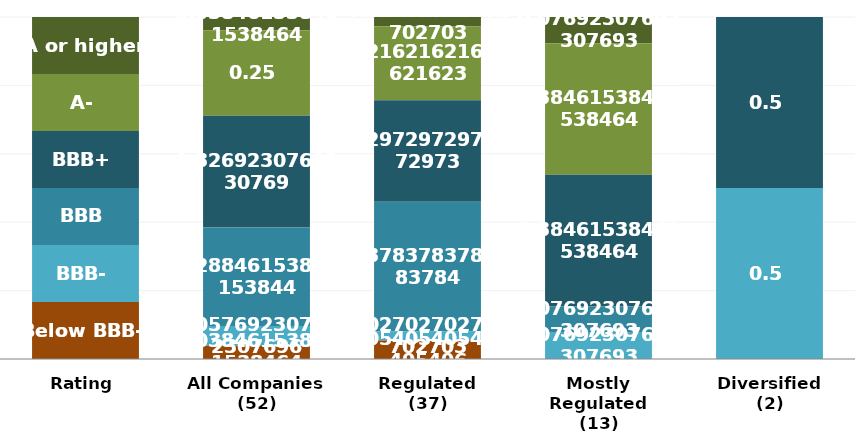
| Category | A or higher | A- | BBB+ | BBB | BBB- | Below BBB- |
|---|---|---|---|---|---|---|
| Rating | 1 | 1 | 1 | 1 | 1 | 1 |
| All Companies
(52) | 2 | 13 | 17 | 15 | 3 | 2 |
| Regulated
(37) | 1 | 8 | 11 | 14 | 1 | 2 |
| Mostly Regulated
(13) | 1 | 5 | 5 | 1 | 1 | 0 |
| Diversified
(2) | 0 | 0 | 1 | 0 | 1 | 0 |